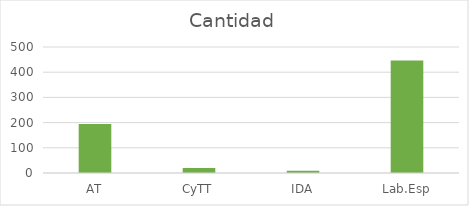
| Category | Cantidad |
|---|---|
| AT | 194 |
| CyTT | 20 |
| IDA | 9 |
| Lab.Esp | 446 |